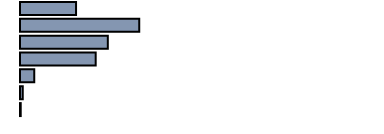
| Category | Series 0 |
|---|---|
| 0 | 15.7 |
| 1 | 33.4 |
| 2 | 24.6 |
| 3 | 21.2 |
| 4 | 4 |
| 5 | 0.8 |
| 6 | 0.2 |